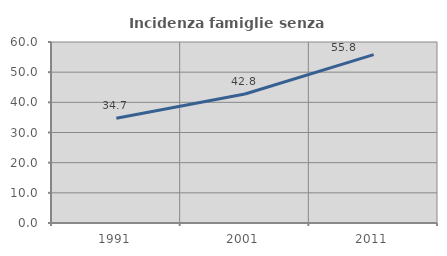
| Category | Incidenza famiglie senza nuclei |
|---|---|
| 1991.0 | 34.744 |
| 2001.0 | 42.75 |
| 2011.0 | 55.814 |